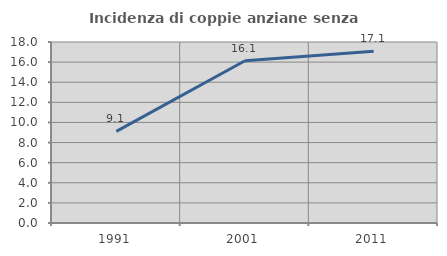
| Category | Incidenza di coppie anziane senza figli  |
|---|---|
| 1991.0 | 9.113 |
| 2001.0 | 16.137 |
| 2011.0 | 17.087 |